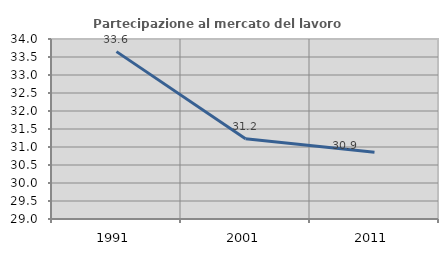
| Category | Partecipazione al mercato del lavoro  femminile |
|---|---|
| 1991.0 | 33.649 |
| 2001.0 | 31.229 |
| 2011.0 | 30.855 |